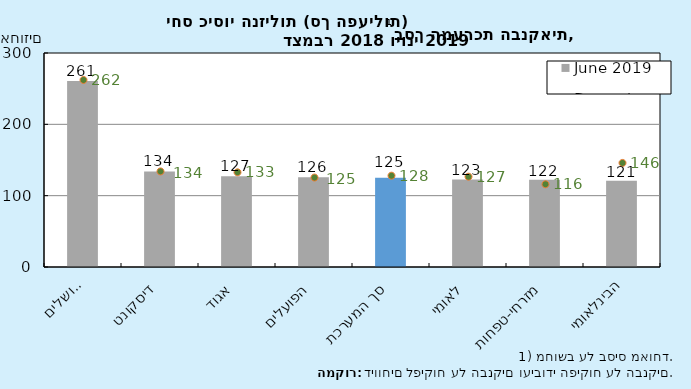
| Category | יוני 2019 |
|---|---|
| ירושלים | 260.649 |
| דיסקונט | 134 |
| אגוד | 127.176 |
| הפועלים | 125.918 |
| סך המערכת | 125 |
| לאומי | 122.558 |
| מזרחי-טפחות | 122.393 |
| הבינלאומי | 121.068 |